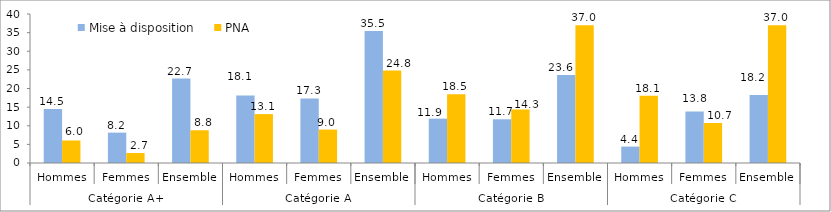
| Category | Mise à disposition | PNA |
|---|---|---|
| 0 | 14.528 | 6.049 |
| 1 | 8.153 | 2.676 |
| 2 | 22.681 | 8.788 |
| 3 | 18.14 | 13.124 |
| 4 | 17.319 | 8.974 |
| 5 | 35.458 | 24.827 |
| 6 | 11.902 | 18.456 |
| 7 | 11.737 | 14.345 |
| 8 | 23.611 | 36.98 |
| 9 | 4.405 | 18.05 |
| 10 | 13.817 | 10.746 |
| 11 | 18.249 | 36.985 |